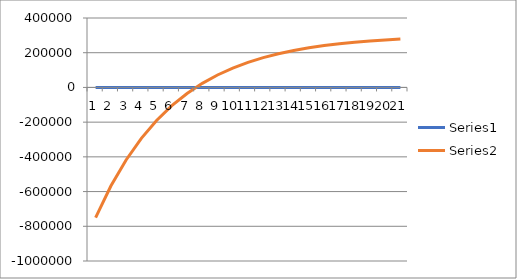
| Category | Series 0 | Series 1 |
|---|---|---|
| 0 | 0 | -750000 |
| 1 | 1 | -568181.818 |
| 2 | 2 | -417768.595 |
| 3 | 3 | -293335.838 |
| 4 | 4 | -190396.011 |
| 5 | 5 | -105236.7 |
| 6 | 6 | -34786.725 |
| 7 | 7 | 23494.619 |
| 8 | 8 | 71709.185 |
| 9 | 9 | 111595.78 |
| 10 | 10 | 144592.872 |
| 11 | 11 | 171890.467 |
| 12 | 12 | 194473.023 |
| 13 | 13 | 213154.955 |
| 14 | 14 | 228610.008 |
| 15 | 15 | 241395.552 |
| 16 | 16 | 251972.684 |
| 17 | 17 | 260722.857 |
| 18 | 18 | 267961.636 |
| 19 | 19 | 273950.081 |
| 20 | 20 | 278904.158 |